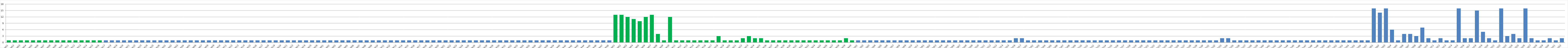
| Category | Series 0 |
|---|---|
| AW01 | 1 |
| AW02 | 1 |
| AW03 | 1 |
| AW04 | 1 |
| AW05 | 1 |
| AW06 | 1 |
| AW07 | 1 |
| AW08 | 1 |
| AW09 | 1 |
| AW10 | 1 |
| AW11 | 1 |
| AW12 | 1 |
| AW13 | 1 |
| AW14 | 1 |
| AW15 | 1 |
| AW16 | 1 |
| AW17 | 1 |
| AW18 | 1 |
| AW19 | 1 |
| AW20 | 1 |
| AW21 | 1 |
| AW22 | 1 |
| AW23 | 1 |
| AW24 | 1 |
| AW25 | 1 |
| AW26 | 1 |
| BW01 | 1 |
| BW02 | 1 |
| BW03 | 1 |
| BWO4 | 1 |
| BW05 | 1 |
| BW06 | 1 |
| BW07 | 1 |
| BW08 | 1 |
| BW09 | 1 |
| BW10 | 1 |
| BW11 | 1 |
| BW12 | 1 |
| BW13 | 1 |
| BW14 | 1 |
| BW15 | 1 |
| BW16 | 1 |
| BW17 | 1 |
| BW18 | 1 |
| BW19 | 1 |
| BW20 | 1 |
| BW21 | 1 |
| BW22 | 1 |
| BW23 | 1 |
| BW24 | 1 |
| BW25 | 1 |
| BW26 | 1 |
| CW01 | 1 |
| CW02 | 1 |
| CW03 | 1 |
| CW04 | 1 |
| CW05 | 1 |
| CW06 | 1 |
| CW07 | 1 |
| CW08 | 1 |
| CW09 | 1 |
| CW10 | 1 |
| CW11 | 1 |
| CW12 | 1 |
| CW13 | 1 |
| CW14 | 1 |
| CW15 | 1 |
| CW16 | 1 |
| CW17 | 1 |
| CW18 | 1 |
| CW19 | 1 |
| CW20 | 1 |
| CW21 | 1 |
| CW22 | 1 |
| CW23 | 1 |
| CW24 | 1 |
| CW25 | 1 |
| CW26 | 1 |
| CW27 | 1 |
| CW28 | 1 |
| CW29 | 1 |
| CW30 | 1 |
| CW31 | 1 |
| CW32 | 1 |
| CW33 | 1 |
| CW34 | 1 |
| CW35 | 1 |
| CW36 | 1 |
| CW37 | 1 |
| CW38 | 1 |
| CW39 | 1 |
| CW40 | 1 |
| CW41 | 1 |
| CW42 | 1 |
| CW43 | 1 |
| CW44 | 1 |
| CW45 | 1 |
| CW46 | 1 |
| CW47 | 1 |
| CW48 | 1 |
| DW01 | 13 |
| DW02 | 13 |
| DW03 | 12 |
| DW04 | 11 |
| DW05 | 10 |
| DW06 | 12 |
| DW07 | 13 |
| DW08 | 4 |
| DW09 | 1 |
| DW10 | 12 |
| DW11 | 1 |
| DW12 | 1 |
| DW13 | 1 |
| DW14 | 1 |
| DW15 | 1 |
| DW16 | 1 |
| DW17 | 1 |
| DW18 | 3 |
| DW19 | 1 |
| DW20 | 1 |
| DW21 | 1 |
| DW22 | 2 |
| DW23 | 3 |
| DW24 | 2 |
| DW25 | 2 |
| DW26 | 1 |
| DW27 | 1 |
| DW28 | 1 |
| DW29 | 1 |
| DW30 | 1 |
| DW31 | 1 |
| DW32 | 1 |
| DW33 | 1 |
| DW34 | 1 |
| DW35 | 1 |
| DW36 | 1 |
| DW37 | 1 |
| DW38 | 1 |
| DW39 | 2 |
| DW40 | 1 |
| AU01 | 1 |
| AU02 | 1 |
| AU03 | 1 |
| AU04 | 1 |
| AU05 | 1 |
| AU06 | 1 |
| AU07 | 1 |
| AU08 | 1 |
| AU09 | 1 |
| AU10 | 1 |
| AU11 | 1 |
| BU01 | 1 |
| BU02 | 1 |
| BU03 | 1 |
| BU04 | 1 |
| BU05 | 1 |
| BU06 | 1 |
| BU07 | 1 |
| BU08 | 1 |
| BU09 | 1 |
| BU10 | 1 |
| BU11 | 1 |
| BU12 | 1 |
| BU13 | 1 |
| BU14 | 1 |
| BU15 | 1 |
| BU16 | 2 |
| BU17 | 2 |
| CU01 | 1 |
| CU02 | 1 |
| CU03 | 1 |
| CU04 | 1 |
| CU05 | 1 |
| CU06 | 1 |
| CU07 | 1 |
| CU08 | 1 |
| CU09 | 1 |
| CU10 | 1 |
| CU11 | 1 |
| CU12 | 1 |
| CU13 | 1 |
| CU14 | 1 |
| CU15 | 1 |
| CU16 | 1 |
| CU17 | 1 |
| CU18 | 1 |
| CU19 | 1 |
| CU20 | 1 |
| CU21 | 1 |
| CU22 | 1 |
| CU23 | 1 |
| CU24 | 1 |
| CU25 | 1 |
| CU26 | 1 |
| CU27 | 1 |
| CU28 | 1 |
| CU29 | 1 |
| CU30 | 1 |
| CU31 | 1 |
| CU32 | 1 |
| CU33 | 2 |
| CU34 | 2 |
| CU35 | 1 |
| CU36 | 1 |
| CU37 | 1 |
| CU38 | 1 |
| CU39 | 1 |
| CU40 | 1 |
| CU41 | 1 |
| CU42 | 1 |
| CU43 | 1 |
| CU44 | 1 |
| CU45 | 1 |
| CU46 | 1 |
| CU47 | 1 |
| CU48 | 1 |
| CU49 | 1 |
| CU50 | 1 |
| CU51 | 1 |
| CU52 | 1 |
| CU53 | 1 |
| CU54 | 1 |
| CU55 | 1 |
| CU56 | 1 |
| CU57 | 1 |
| DU01 | 16 |
| DU02 | 14 |
| DU03 | 16 |
| DU04 | 6 |
| DU05 | 1 |
| DU06 | 4 |
| DU07 | 4 |
| DU08 | 3 |
| DU09 | 7 |
| DU10 | 2 |
| DU11 | 1 |
| DU12 | 2 |
| DU13 | 1 |
| DU14 | 1 |
| DU15 | 16 |
| DU16 | 2 |
| DU17 | 2 |
| DU18 | 15 |
| DU19 | 5 |
| DU20 | 2 |
| DU21 | 1 |
| DU22 | 16 |
| DU23 | 3 |
| DU24 | 4 |
| DU25 | 2 |
| DU26 | 16 |
| DU27 | 2 |
| DU28 | 1 |
| DU29 | 1 |
| DU30 | 2 |
| DU31 | 1 |
| DU32 | 2 |